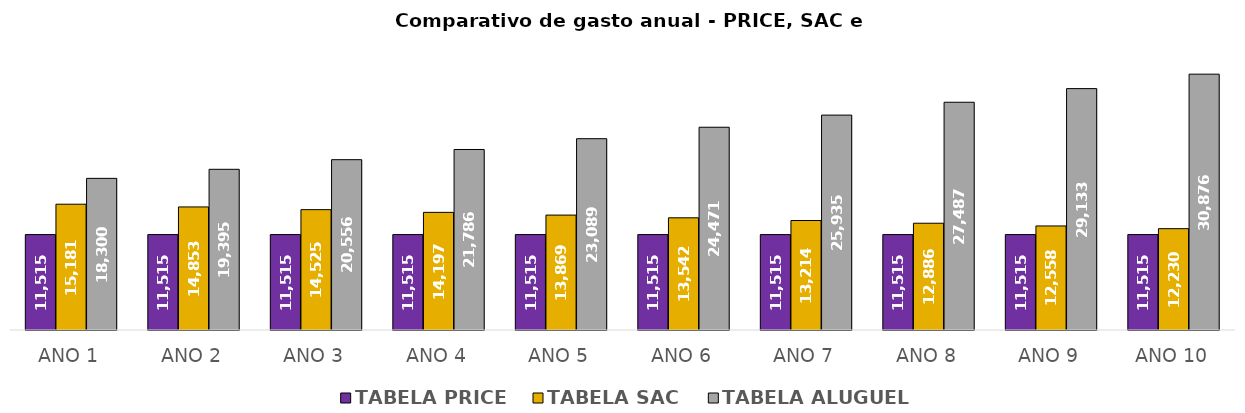
| Category | TABELA PRICE | TABELA SAC | TABELA ALUGUEL |
|---|---|---|---|
| ANO 1 | 11514.916 | 15181.24 | 18300 |
| ANO 2 | 11514.916 | 14853.3 | 19395 |
| ANO 3 | 11514.916 | 14525.359 | 20555.55 |
| ANO 4 | 11514.916 | 14197.419 | 21785.576 |
| ANO 5 | 11514.916 | 13869.479 | 23089.237 |
| ANO 6 | 11514.916 | 13541.538 | 24470.945 |
| ANO 7 | 11514.916 | 13213.598 | 25935.373 |
| ANO 8 | 11514.916 | 12885.657 | 27487.475 |
| ANO 9 | 11514.916 | 12557.717 | 29132.502 |
| ANO 10 | 11514.916 | 12229.776 | 30876.02 |